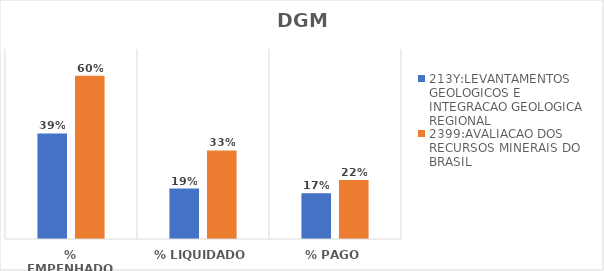
| Category | 213Y:LEVANTAMENTOS GEOLOGICOS E INTEGRACAO GEOLOGICA REGIONAL | 2399:AVALIACAO DOS RECURSOS MINERAIS DO BRASIL |
|---|---|---|
| % EMPENHADO | 0.389 | 0.601 |
| % LIQUIDADO | 0.186 | 0.326 |
| % PAGO | 0.168 | 0.217 |